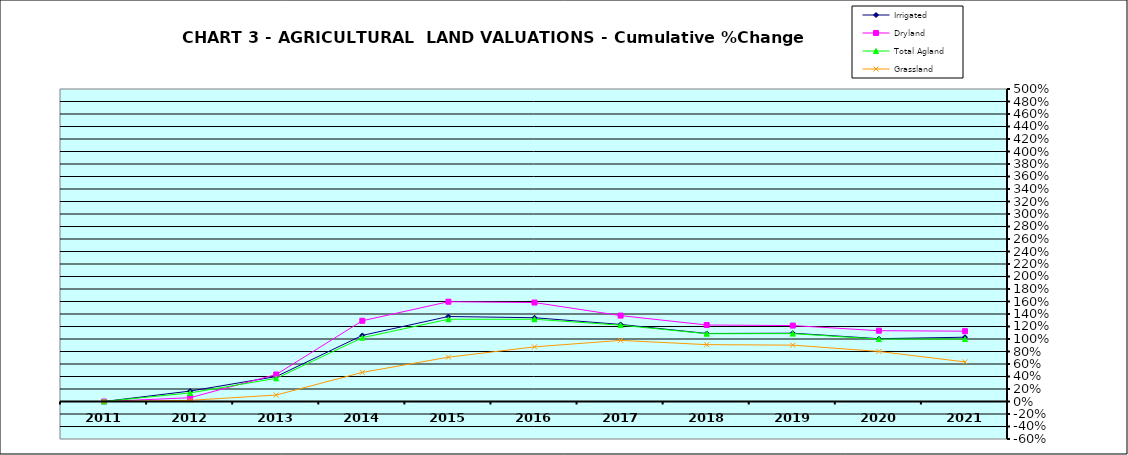
| Category | Irrigated | Dryland | Total Agland | Grassland |
|---|---|---|---|---|
| 2011.0 | 0 | 0 | 0 | 0 |
| 2012.0 | 0.167 | 0.061 | 0.138 | 0.019 |
| 2013.0 | 0.399 | 0.432 | 0.371 | 0.103 |
| 2014.0 | 1.058 | 1.292 | 1.021 | 0.466 |
| 2015.0 | 1.36 | 1.597 | 1.316 | 0.709 |
| 2016.0 | 1.34 | 1.583 | 1.316 | 0.874 |
| 2017.0 | 1.233 | 1.375 | 1.222 | 0.978 |
| 2018.0 | 1.088 | 1.224 | 1.084 | 0.91 |
| 2019.0 | 1.093 | 1.215 | 1.086 | 0.902 |
| 2020.0 | 1.005 | 1.133 | 0.999 | 0.801 |
| 2021.0 | 1.029 | 1.125 | 0.999 | 0.634 |